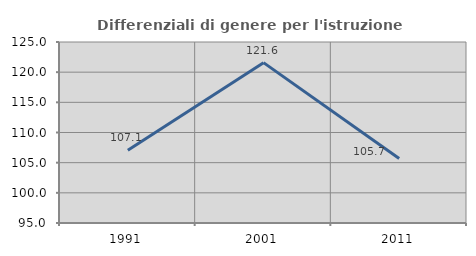
| Category | Differenziali di genere per l'istruzione superiore |
|---|---|
| 1991.0 | 107.059 |
| 2001.0 | 121.58 |
| 2011.0 | 105.696 |